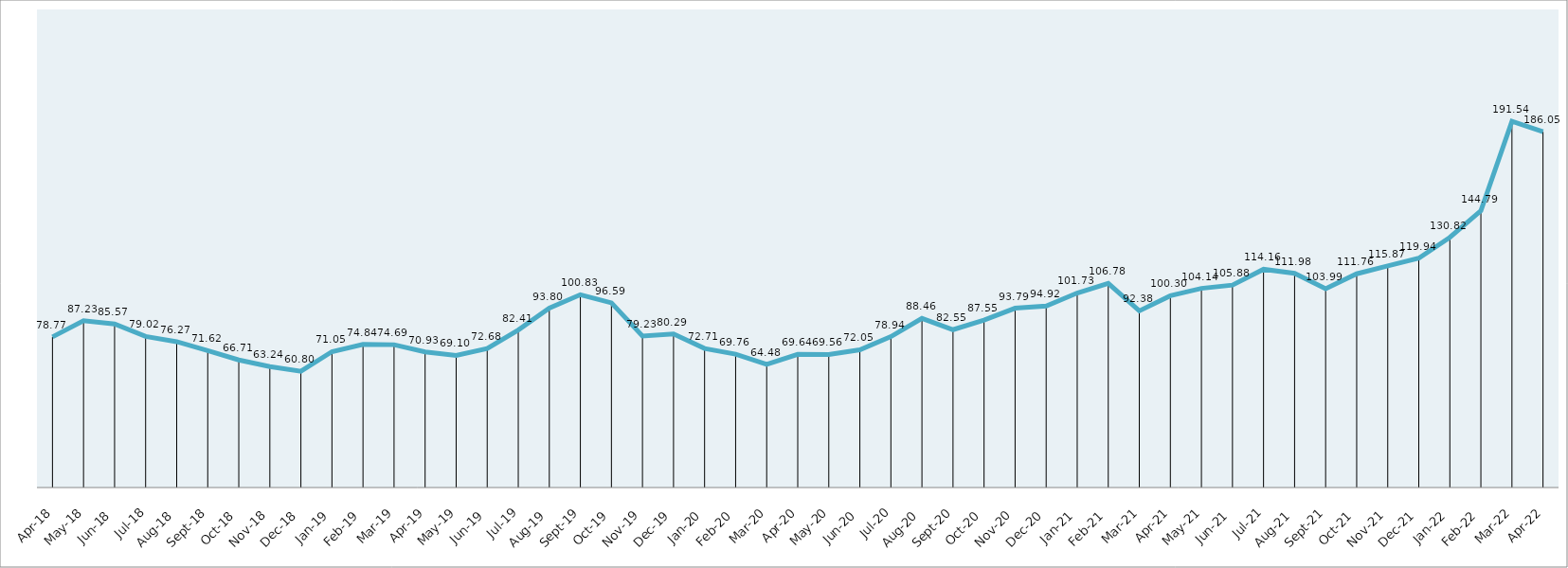
| Category | Series 0 |
|---|---|
| 2018-04-30 | 78.766 |
| 2018-05-31 | 87.231 |
| 2018-06-30 | 85.567 |
| 2018-07-31 | 79.024 |
| 2018-08-31 | 76.27 |
| 2018-09-30 | 71.621 |
| 2018-10-31 | 66.714 |
| 2018-11-30 | 63.242 |
| 2018-12-31 | 60.803 |
| 2019-01-31 | 71.047 |
| 2019-02-28 | 74.835 |
| 2019-03-31 | 74.692 |
| 2019-04-30 | 70.933 |
| 2019-05-31 | 69.096 |
| 2019-06-30 | 72.683 |
| 2019-07-31 | 82.41 |
| 2019-08-31 | 93.802 |
| 2019-09-30 | 100.832 |
| 2019-10-31 | 96.585 |
| 2019-11-30 | 79.225 |
| 2019-12-31 | 80.287 |
| 2020-01-31 | 72.712 |
| 2020-02-29 | 69.756 |
| 2020-03-31 | 64.476 |
| 2020-04-30 | 69.636 |
| 2020-05-31 | 69.555 |
| 2020-06-30 | 72.052 |
| 2020-07-31 | 78.944 |
| 2020-08-31 | 88.459 |
| 2020-09-30 | 82.554 |
| 2020-10-31 | 87.552 |
| 2020-11-30 | 93.791 |
| 2020-12-31 | 94.921 |
| 2021-01-31 | 101.733 |
| 2021-02-28 | 106.783 |
| 2021-03-31 | 92.385 |
| 2021-04-30 | 100.298 |
| 2021-05-31 | 104.143 |
| 2021-06-30 | 105.882 |
| 2021-07-31 | 114.158 |
| 2021-08-31 | 111.983 |
| 2021-09-30 | 103.989 |
| 2021-10-31 | 111.765 |
| 2021-11-30 | 115.868 |
| 2021-12-31 | 119.943 |
| 2022-01-31 | 130.818 |
| 2022-02-28 | 144.792 |
| 2022-03-31 | 191.535 |
| 2022-04-30 | 186.055 |